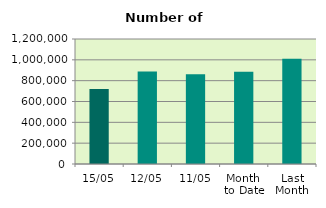
| Category | Series 0 |
|---|---|
| 15/05 | 721200 |
| 12/05 | 887560 |
| 11/05 | 861506 |
| Month 
to Date | 885891.6 |
| Last
Month | 1010681.333 |